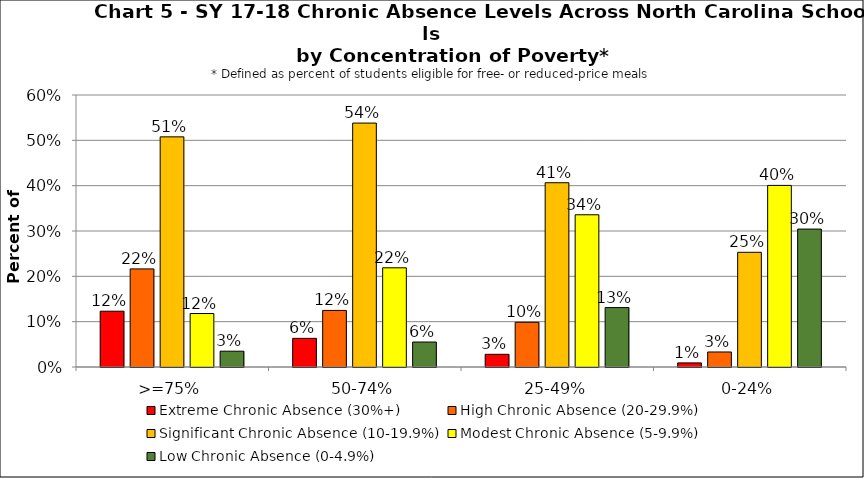
| Category | Extreme Chronic Absence (30%+) | High Chronic Absence (20-29.9%) | Significant Chronic Absence (10-19.9%) | Modest Chronic Absence (5-9.9%) | Low Chronic Absence (0-4.9%) |
|---|---|---|---|---|---|
| 0 | 0.123 | 0.216 | 0.508 | 0.118 | 0.035 |
| 1 | 0.063 | 0.125 | 0.538 | 0.219 | 0.055 |
| 2 | 0.028 | 0.099 | 0.406 | 0.336 | 0.131 |
| 3 | 0.009 | 0.033 | 0.253 | 0.401 | 0.304 |